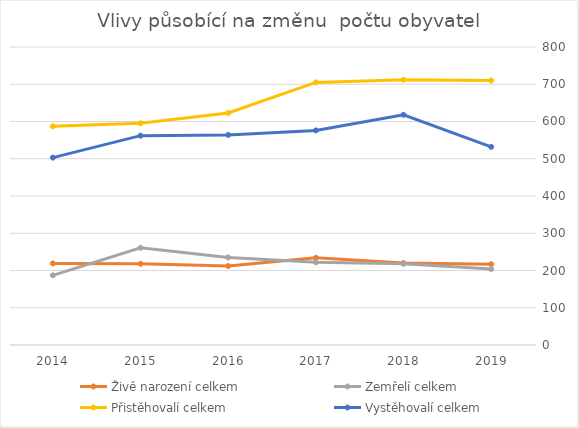
| Category | Živě narození celkem | Zemřelí celkem | Přistěhovalí celkem | Vystěhovalí celkem |
|---|---|---|---|---|
| 2019.0 | 217 | 204 | 710 | 532 |
| 2018.0 | 220 | 218 | 712 | 618 |
| 2017.0 | 234 | 222 | 705 | 576 |
| 2016.0 | 212 | 235 | 623 | 564 |
| 2015.0 | 218 | 261 | 595 | 562 |
| 2014.0 | 219 | 187 | 587 | 503 |